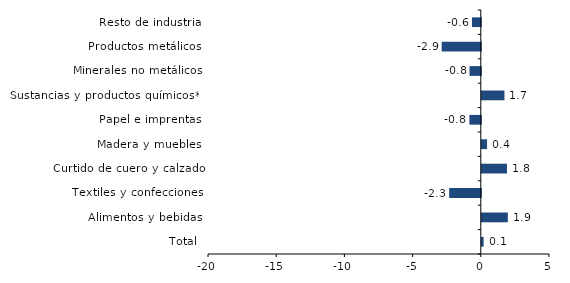
| Category | Series 0 |
|---|---|
| Total | 0.133 |
| Alimentos y bebidas | 1.91 |
| Textiles y confecciones | -2.319 |
| Curtido de cuero y calzado | 1.844 |
| Madera y muebles | 0.386 |
| Papel e imprentas | -0.836 |
| Sustancias y productos químicos** | 1.662 |
| Minerales no metálicos | -0.828 |
| Productos metálicos | -2.867 |
| Resto de industria | -0.648 |